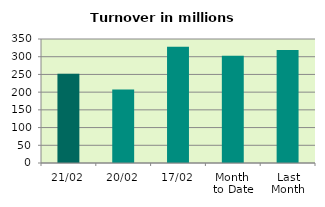
| Category | Series 0 |
|---|---|
| 21/02 | 251.659 |
| 20/02 | 207.231 |
| 17/02 | 328.149 |
| Month 
to Date | 302.443 |
| Last
Month | 318.977 |